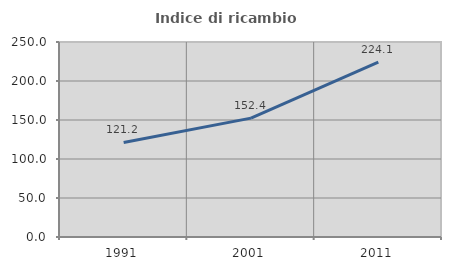
| Category | Indice di ricambio occupazionale  |
|---|---|
| 1991.0 | 121.212 |
| 2001.0 | 152.381 |
| 2011.0 | 224.077 |